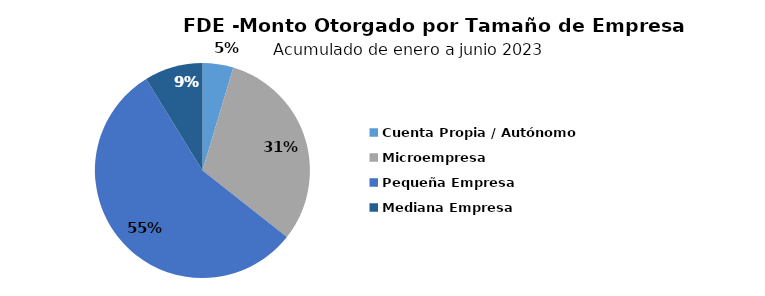
| Category | Monto |
|---|---|
| Cuenta Propia / Autónomo | 0.211 |
| Microempresa | 1.414 |
| Pequeña Empresa | 2.535 |
| Mediana Empresa | 0.4 |